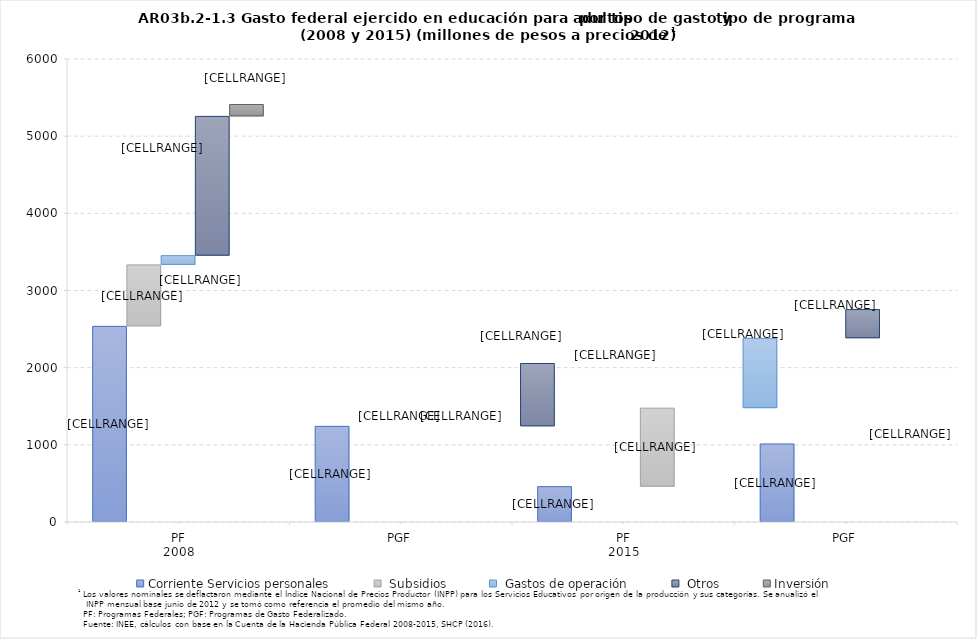
| Category | Corriente Servicios personales | Corriente Subsidios | Corriente Gastos de operación | Corriente Otros | Inversión |
|---|---|---|---|---|---|
| 0 | 2535.18 | 796.4 | 120.03 | 1804.66 | 153.56 |
| 1 | 1239.22 | 0 | 0 | 814.97 | 0 |
| 2 | 457.92 | 1017.39 | 905.47 | 371.79 | 74.46 |
| 3 | 1011.57 | 0 | 0 | 649.56 | 0 |